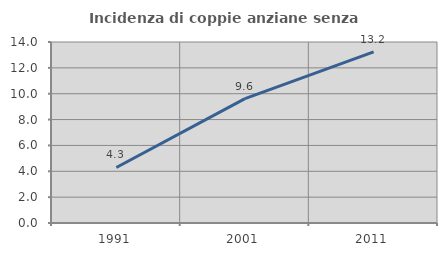
| Category | Incidenza di coppie anziane senza figli  |
|---|---|
| 1991.0 | 4.294 |
| 2001.0 | 9.615 |
| 2011.0 | 13.23 |